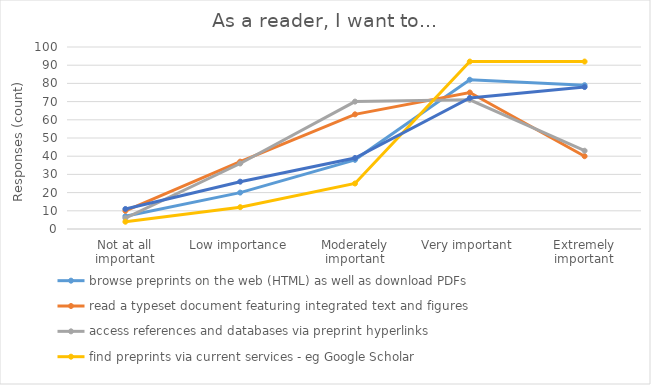
| Category | browse preprints on the web (HTML) as well as download PDFs | read a typeset document featuring integrated text and figures | access references and databases via preprint hyperlinks | find preprints via current services - eg Google Scholar | find preprints via services like PubMed, Web of Science, Scopus (now for peer reviewed papers) |
|---|---|---|---|---|---|
| Not at all important | 7 | 10 | 6 | 4 | 11 |
| Low importance | 20 | 37 | 36 | 12 | 26 |
| Moderately important | 38 | 63 | 70 | 25 | 39 |
| Very important | 82 | 75 | 71 | 92 | 72 |
| Extremely important | 79 | 40 | 43 | 92 | 78 |